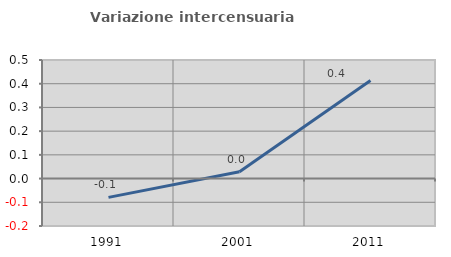
| Category | Variazione intercensuaria annua |
|---|---|
| 1991.0 | -0.079 |
| 2001.0 | 0.029 |
| 2011.0 | 0.413 |